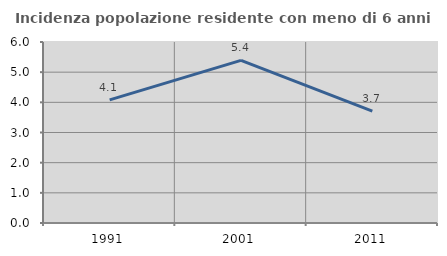
| Category | Incidenza popolazione residente con meno di 6 anni |
|---|---|
| 1991.0 | 4.082 |
| 2001.0 | 5.392 |
| 2011.0 | 3.706 |